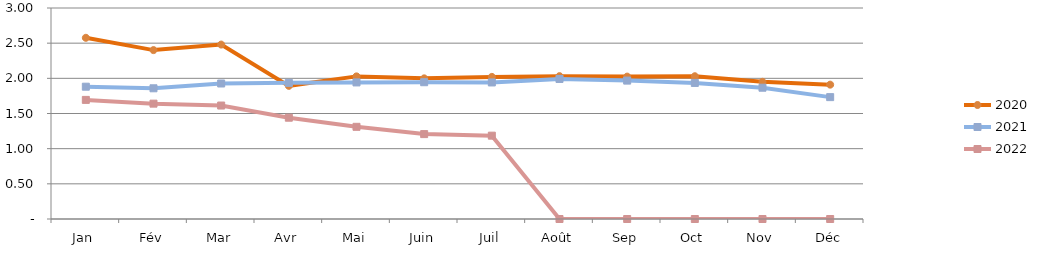
| Category | 2020 | 2021 | 2022 |
|---|---|---|---|
| Jan | 2.576 | 1.881 | 1.693 |
| Fév | 2.401 | 1.858 | 1.64 |
| Mar | 2.48 | 1.927 | 1.613 |
| Avr | 1.893 | 1.936 | 1.44 |
| Mai | 2.028 | 1.942 | 1.311 |
| Juin | 2 | 1.945 | 1.207 |
| Juil | 2.021 | 1.941 | 1.185 |
| Août | 2.031 | 1.991 | 0 |
| Sep | 2.024 | 1.968 | 0 |
| Oct | 2.03 | 1.934 | 0 |
| Nov | 1.95 | 1.867 | 0 |
| Déc | 1.91 | 1.733 | 0 |